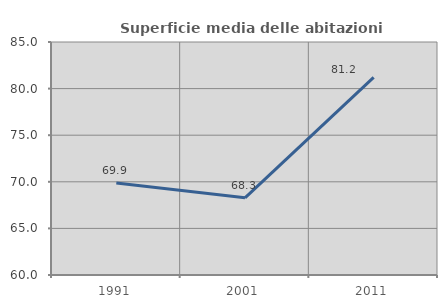
| Category | Superficie media delle abitazioni occupate |
|---|---|
| 1991.0 | 69.864 |
| 2001.0 | 68.282 |
| 2011.0 | 81.212 |